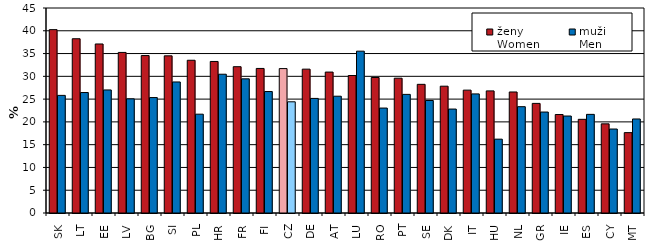
| Category | ženy
Women | muži
Men |
|---|---|---|
| SK | 40.253 | 25.818 |
| LT | 38.251 | 26.446 |
| EE | 37.103 | 27.011 |
| LV | 35.248 | 25.06 |
| BG | 34.557 | 25.339 |
| SI | 34.499 | 28.764 |
| PL | 33.53 | 21.694 |
| HR | 33.265 | 30.462 |
| FR | 32.116 | 29.452 |
| FI | 31.731 | 26.661 |
| CZ | 31.702 | 24.409 |
| DE | 31.577 | 25.152 |
| AT | 30.937 | 25.638 |
| LU | 30.182 | 35.527 |
| RO | 29.743 | 23.035 |
| PT | 29.591 | 26.038 |
| SE | 28.243 | 24.697 |
| DK | 27.836 | 22.818 |
| IT | 26.971 | 26.144 |
| HU | 26.807 | 16.21 |
| NL | 26.567 | 23.34 |
| GR | 24.06 | 22.161 |
| IE | 21.616 | 21.287 |
| ES | 20.564 | 21.65 |
| CY | 19.571 | 18.433 |
| MT | 17.643 | 20.639 |